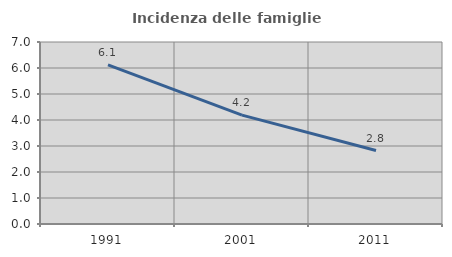
| Category | Incidenza delle famiglie numerose |
|---|---|
| 1991.0 | 6.121 |
| 2001.0 | 4.188 |
| 2011.0 | 2.824 |